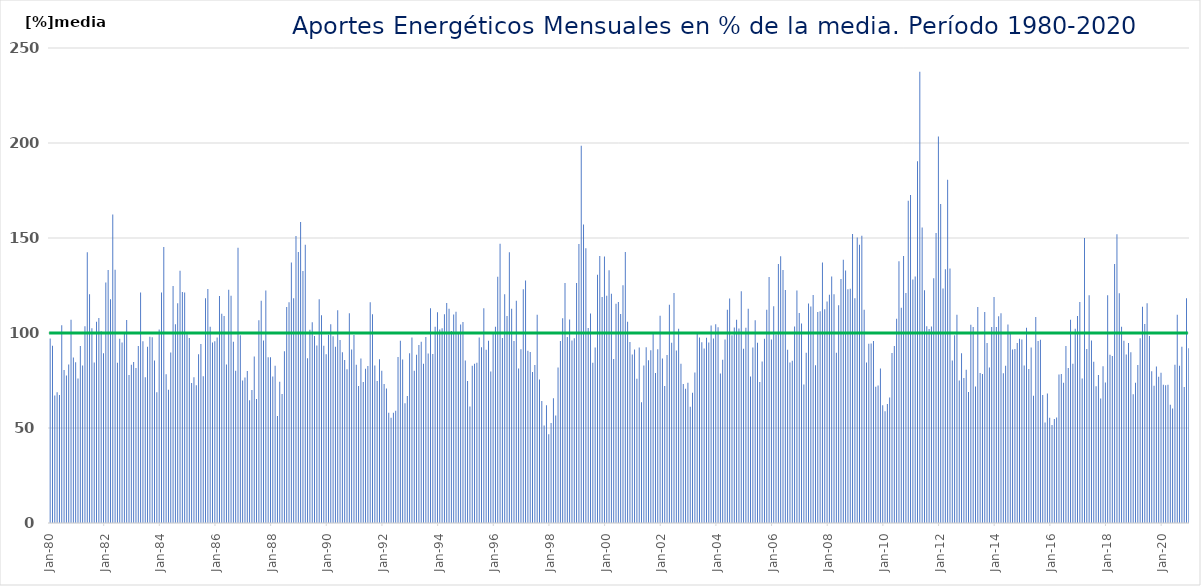
| Category | Series 0 |
|---|---|
| 1980-01-01 | 97.04 |
| 1980-02-01 | 93.35 |
| 1980-03-01 | 67.09 |
| 1980-04-01 | 68.78 |
| 1980-05-01 | 67.31 |
| 1980-06-01 | 104.04 |
| 1980-07-01 | 80.58 |
| 1980-08-01 | 77.65 |
| 1980-09-01 | 83.41 |
| 1980-10-01 | 107.02 |
| 1980-11-01 | 87.07 |
| 1980-12-01 | 84.62 |
| 1981-01-01 | 76.09 |
| 1981-02-01 | 93.13 |
| 1981-03-01 | 82.86 |
| 1981-04-01 | 103.58 |
| 1981-05-01 | 142.54 |
| 1981-06-01 | 120.41 |
| 1981-07-01 | 102.54 |
| 1981-08-01 | 84.46 |
| 1981-09-01 | 105.87 |
| 1981-10-01 | 107.93 |
| 1981-11-01 | 100.89 |
| 1981-12-01 | 89.32 |
| 1982-01-01 | 126.58 |
| 1982-02-01 | 133.17 |
| 1982-03-01 | 117.7 |
| 1982-04-01 | 162.43 |
| 1982-05-01 | 133.25 |
| 1982-06-01 | 84.28 |
| 1982-07-01 | 97.02 |
| 1982-08-01 | 94.94 |
| 1982-09-01 | 99.74 |
| 1982-10-01 | 106.89 |
| 1982-11-01 | 77.84 |
| 1982-12-01 | 83.27 |
| 1983-01-01 | 84.79 |
| 1983-02-01 | 81.56 |
| 1983-03-01 | 93.2 |
| 1983-04-01 | 121.37 |
| 1983-05-01 | 95.6 |
| 1983-06-01 | 76.69 |
| 1983-07-01 | 92.78 |
| 1983-08-01 | 97.99 |
| 1983-09-01 | 97.82 |
| 1983-10-01 | 85.51 |
| 1983-11-01 | 68.86 |
| 1983-12-01 | 101.85 |
| 1984-01-01 | 121.28 |
| 1984-02-01 | 145.3 |
| 1984-03-01 | 78.25 |
| 1984-04-01 | 70.14 |
| 1984-05-01 | 89.79 |
| 1984-06-01 | 124.8 |
| 1984-07-01 | 104.56 |
| 1984-08-01 | 115.72 |
| 1984-09-01 | 132.71 |
| 1984-10-01 | 121.58 |
| 1984-11-01 | 121.38 |
| 1984-12-01 | 99.3 |
| 1985-01-01 | 97.43 |
| 1985-02-01 | 73.7 |
| 1985-03-01 | 76.66 |
| 1985-04-01 | 72.49 |
| 1985-05-01 | 88.86 |
| 1985-06-01 | 94.27 |
| 1985-07-01 | 77.21 |
| 1985-08-01 | 118.3 |
| 1985-09-01 | 123.13 |
| 1985-10-01 | 103.23 |
| 1985-11-01 | 94.98 |
| 1985-12-01 | 95.66 |
| 1986-01-01 | 97.6 |
| 1986-02-01 | 119.45 |
| 1986-03-01 | 110.15 |
| 1986-04-01 | 108.98 |
| 1986-05-01 | 83.38 |
| 1986-06-01 | 122.73 |
| 1986-07-01 | 119.6 |
| 1986-08-01 | 95.37 |
| 1986-09-01 | 80.1 |
| 1986-10-01 | 144.84 |
| 1986-11-01 | 98.88 |
| 1986-12-01 | 74.94 |
| 1987-01-01 | 76.57 |
| 1987-02-01 | 80.06 |
| 1987-03-01 | 64.64 |
| 1987-04-01 | 70.06 |
| 1987-05-01 | 87.69 |
| 1987-06-01 | 65.27 |
| 1987-07-01 | 106.76 |
| 1987-08-01 | 116.97 |
| 1987-09-01 | 96.06 |
| 1987-10-01 | 122.32 |
| 1987-11-01 | 87.29 |
| 1987-12-01 | 87.24 |
| 1988-01-01 | 77.1 |
| 1988-02-01 | 82.79 |
| 1988-03-01 | 56.32 |
| 1988-04-01 | 74.33 |
| 1988-05-01 | 67.95 |
| 1988-06-01 | 90.45 |
| 1988-07-01 | 113.65 |
| 1988-08-01 | 116.23 |
| 1988-09-01 | 137.09 |
| 1988-10-01 | 118.27 |
| 1988-11-01 | 151.03 |
| 1988-12-01 | 142.66 |
| 1989-01-01 | 158.47 |
| 1989-02-01 | 132.61 |
| 1989-03-01 | 146.47 |
| 1989-04-01 | 86.71 |
| 1989-05-01 | 101.69 |
| 1989-06-01 | 105.63 |
| 1989-07-01 | 98.4 |
| 1989-08-01 | 93.48 |
| 1989-09-01 | 117.73 |
| 1989-10-01 | 109.33 |
| 1989-11-01 | 93.3 |
| 1989-12-01 | 88.76 |
| 1990-01-01 | 99.14 |
| 1990-02-01 | 104.59 |
| 1990-03-01 | 98.31 |
| 1990-04-01 | 92.75 |
| 1990-05-01 | 112.01 |
| 1990-06-01 | 96.3 |
| 1990-07-01 | 89.82 |
| 1990-08-01 | 85.79 |
| 1990-09-01 | 80.94 |
| 1990-10-01 | 110.4 |
| 1990-11-01 | 91.31 |
| 1990-12-01 | 98.96 |
| 1991-01-01 | 83.24 |
| 1991-02-01 | 72.17 |
| 1991-03-01 | 86.57 |
| 1991-04-01 | 74.15 |
| 1991-05-01 | 81.15 |
| 1991-06-01 | 82.64 |
| 1991-07-01 | 116.13 |
| 1991-08-01 | 109.88 |
| 1991-09-01 | 82.85 |
| 1991-10-01 | 74.69 |
| 1991-11-01 | 86.12 |
| 1991-12-01 | 80.16 |
| 1992-01-01 | 73.19 |
| 1992-02-01 | 70.83 |
| 1992-03-01 | 58.03 |
| 1992-04-01 | 55.34 |
| 1992-05-01 | 58.02 |
| 1992-06-01 | 59.04 |
| 1992-07-01 | 87.42 |
| 1992-08-01 | 95.98 |
| 1992-09-01 | 86.07 |
| 1992-10-01 | 63.03 |
| 1992-11-01 | 66.87 |
| 1992-12-01 | 89.37 |
| 1993-01-01 | 97.68 |
| 1993-02-01 | 80.17 |
| 1993-03-01 | 88.53 |
| 1993-04-01 | 93.73 |
| 1993-05-01 | 95.35 |
| 1993-06-01 | 83.84 |
| 1993-07-01 | 97.85 |
| 1993-08-01 | 89.16 |
| 1993-09-01 | 113.04 |
| 1993-10-01 | 88.94 |
| 1993-11-01 | 103.23 |
| 1993-12-01 | 110.94 |
| 1994-01-01 | 101.81 |
| 1994-02-01 | 102.5 |
| 1994-03-01 | 109.85 |
| 1994-04-01 | 115.8 |
| 1994-05-01 | 112.75 |
| 1994-06-01 | 101.09 |
| 1994-07-01 | 109.73 |
| 1994-08-01 | 111.21 |
| 1994-09-01 | 99.61 |
| 1994-10-01 | 104.49 |
| 1994-11-01 | 105.84 |
| 1994-12-01 | 85.47 |
| 1995-01-01 | 74.75 |
| 1995-02-01 | 61.31 |
| 1995-03-01 | 82.7 |
| 1995-04-01 | 83.83 |
| 1995-05-01 | 84.34 |
| 1995-06-01 | 97.64 |
| 1995-07-01 | 92.49 |
| 1995-08-01 | 112.97 |
| 1995-09-01 | 91.16 |
| 1995-10-01 | 95.92 |
| 1995-11-01 | 79.7 |
| 1995-12-01 | 100.26 |
| 1996-01-01 | 103.28 |
| 1996-02-01 | 129.59 |
| 1996-03-01 | 146.99 |
| 1996-04-01 | 97.32 |
| 1996-05-01 | 120.45 |
| 1996-06-01 | 108.96 |
| 1996-07-01 | 142.47 |
| 1996-08-01 | 112.78 |
| 1996-09-01 | 95.81 |
| 1996-10-01 | 117.02 |
| 1996-11-01 | 81.31 |
| 1996-12-01 | 91.44 |
| 1997-01-01 | 123 |
| 1997-02-01 | 127.69 |
| 1997-03-01 | 90.72 |
| 1997-04-01 | 89.95 |
| 1997-05-01 | 79.41 |
| 1997-06-01 | 83.19 |
| 1997-07-01 | 109.56 |
| 1997-08-01 | 75.53 |
| 1997-09-01 | 64.16 |
| 1997-10-01 | 51.33 |
| 1997-11-01 | 62.01 |
| 1997-12-01 | 46.72 |
| 1998-01-01 | 52.57 |
| 1998-02-01 | 65.64 |
| 1998-03-01 | 56.62 |
| 1998-04-01 | 81.8 |
| 1998-05-01 | 95.84 |
| 1998-06-01 | 107.71 |
| 1998-07-01 | 126.33 |
| 1998-08-01 | 97.93 |
| 1998-09-01 | 107.14 |
| 1998-10-01 | 96.11 |
| 1998-11-01 | 97.22 |
| 1998-12-01 | 126.31 |
| 1999-01-01 | 146.82 |
| 1999-02-01 | 198.57 |
| 1999-03-01 | 157.13 |
| 1999-04-01 | 144.61 |
| 1999-05-01 | 102.66 |
| 1999-06-01 | 110.26 |
| 1999-07-01 | 84.29 |
| 1999-08-01 | 92.38 |
| 1999-09-01 | 130.65 |
| 1999-10-01 | 140.53 |
| 1999-11-01 | 118.96 |
| 1999-12-01 | 140.29 |
| 2000-01-01 | 119.62 |
| 2000-02-01 | 133.06 |
| 2000-03-01 | 120.6 |
| 2000-04-01 | 86.35 |
| 2000-05-01 | 115.37 |
| 2000-06-01 | 116.35 |
| 2000-07-01 | 109.94 |
| 2000-08-01 | 125.19 |
| 2000-09-01 | 142.6 |
| 2000-10-01 | 105.91 |
| 2000-11-01 | 95.2 |
| 2000-12-01 | 88.69 |
| 2001-01-01 | 91.38 |
| 2001-02-01 | 75.89 |
| 2001-03-01 | 92.39 |
| 2001-04-01 | 63.58 |
| 2001-05-01 | 82.86 |
| 2001-06-01 | 92.49 |
| 2001-07-01 | 85.71 |
| 2001-08-01 | 90.87 |
| 2001-09-01 | 100.54 |
| 2001-10-01 | 78.96 |
| 2001-11-01 | 91.42 |
| 2001-12-01 | 109.04 |
| 2002-01-01 | 86.59 |
| 2002-02-01 | 72.11 |
| 2002-03-01 | 88.36 |
| 2002-04-01 | 114.88 |
| 2002-05-01 | 94.83 |
| 2002-06-01 | 121.11 |
| 2002-07-01 | 90.82 |
| 2002-08-01 | 102.25 |
| 2002-09-01 | 83.8 |
| 2002-10-01 | 73.11 |
| 2002-11-01 | 70.69 |
| 2002-12-01 | 73.83 |
| 2003-01-01 | 61.14 |
| 2003-02-01 | 68.6 |
| 2003-03-01 | 79.2 |
| 2003-04-01 | 99.86 |
| 2003-05-01 | 97.59 |
| 2003-06-01 | 95.08 |
| 2003-07-01 | 91.81 |
| 2003-08-01 | 97.51 |
| 2003-09-01 | 95.06 |
| 2003-10-01 | 103.92 |
| 2003-11-01 | 97.06 |
| 2003-12-01 | 104.64 |
| 2004-01-01 | 102.99 |
| 2004-02-01 | 78.65 |
| 2004-03-01 | 85.88 |
| 2004-04-01 | 96.6 |
| 2004-05-01 | 112.2 |
| 2004-06-01 | 118.21 |
| 2004-07-01 | 98.77 |
| 2004-08-01 | 102.94 |
| 2004-09-01 | 106.91 |
| 2004-10-01 | 102.36 |
| 2004-11-01 | 121.99 |
| 2004-12-01 | 91.76 |
| 2005-01-01 | 102.74 |
| 2005-02-01 | 112.7 |
| 2005-03-01 | 77.04 |
| 2005-04-01 | 92.41 |
| 2005-05-01 | 106.77 |
| 2005-06-01 | 94.89 |
| 2005-07-01 | 74.19 |
| 2005-08-01 | 85.05 |
| 2005-09-01 | 96.96 |
| 2005-10-01 | 112.18 |
| 2005-11-01 | 129.53 |
| 2005-12-01 | 96.56 |
| 2006-01-01 | 114.05 |
| 2006-02-01 | 99.18 |
| 2006-03-01 | 136.28 |
| 2006-04-01 | 140.4 |
| 2006-05-01 | 133.12 |
| 2006-06-01 | 122.69 |
| 2006-07-01 | 91.2 |
| 2006-08-01 | 84.48 |
| 2006-09-01 | 85.37 |
| 2006-10-01 | 103.39 |
| 2006-11-01 | 122.43 |
| 2006-12-01 | 110.55 |
| 2007-01-01 | 104.97 |
| 2007-02-01 | 72.88 |
| 2007-03-01 | 89.6 |
| 2007-04-01 | 115.48 |
| 2007-05-01 | 113.89 |
| 2007-06-01 | 119.95 |
| 2007-07-01 | 83.01 |
| 2007-08-01 | 111.02 |
| 2007-09-01 | 111.4 |
| 2007-10-01 | 137.13 |
| 2007-11-01 | 112.44 |
| 2007-12-01 | 116.53 |
| 2008-01-01 | 120.18 |
| 2008-02-01 | 129.79 |
| 2008-03-01 | 120.43 |
| 2008-04-01 | 89.6 |
| 2008-05-01 | 114.6 |
| 2008-06-01 | 128.42 |
| 2008-07-01 | 138.5 |
| 2008-08-01 | 132.84 |
| 2008-09-01 | 123.02 |
| 2008-10-01 | 123.34 |
| 2008-11-01 | 152.15 |
| 2008-12-01 | 118.29 |
| 2009-01-01 | 150.22 |
| 2009-02-01 | 146.39 |
| 2009-03-01 | 151.2 |
| 2009-04-01 | 112.28 |
| 2009-05-01 | 84.47 |
| 2009-06-01 | 94.28 |
| 2009-07-01 | 94.43 |
| 2009-08-01 | 95.85 |
| 2009-09-01 | 71.73 |
| 2009-10-01 | 72.35 |
| 2009-11-01 | 81.26 |
| 2009-12-01 | 62 |
| 2010-01-01 | 58.78 |
| 2010-02-01 | 62.6 |
| 2010-03-01 | 66.08 |
| 2010-04-01 | 89.48 |
| 2010-05-01 | 93.16 |
| 2010-06-01 | 107.49 |
| 2010-07-01 | 137.75 |
| 2010-08-01 | 113.23 |
| 2010-09-01 | 140.58 |
| 2010-10-01 | 121.11 |
| 2010-11-01 | 169.63 |
| 2010-12-01 | 172.58 |
| 2011-01-01 | 128.19 |
| 2011-02-01 | 129.79 |
| 2011-03-01 | 190.43 |
| 2011-04-01 | 237.47 |
| 2011-05-01 | 155.51 |
| 2011-06-01 | 122.56 |
| 2011-07-01 | 103.58 |
| 2011-08-01 | 102.13 |
| 2011-09-01 | 103.38 |
| 2011-10-01 | 128.77 |
| 2011-11-01 | 152.68 |
| 2011-12-01 | 203.47 |
| 2012-01-01 | 167.9 |
| 2012-02-01 | 123.42 |
| 2012-03-01 | 133.54 |
| 2012-04-01 | 180.7 |
| 2012-05-01 | 133.9 |
| 2012-06-01 | 85.59 |
| 2012-07-01 | 98.79 |
| 2012-08-01 | 109.6 |
| 2012-09-01 | 75.06 |
| 2012-10-01 | 89.35 |
| 2012-11-01 | 76.28 |
| 2012-12-01 | 80.61 |
| 2013-01-01 | 68.96 |
| 2013-02-01 | 104.34 |
| 2013-03-01 | 103.22 |
| 2013-04-01 | 71.78 |
| 2013-05-01 | 113.7 |
| 2013-06-01 | 78.97 |
| 2013-07-01 | 78.46 |
| 2013-08-01 | 111 |
| 2013-09-01 | 94.74 |
| 2013-10-01 | 81.81 |
| 2013-11-01 | 103.1 |
| 2013-12-01 | 119.01 |
| 2014-01-01 | 103.18 |
| 2014-02-01 | 108.85 |
| 2014-03-01 | 110.33 |
| 2014-04-01 | 78.86 |
| 2014-05-01 | 82.7 |
| 2014-06-01 | 104.42 |
| 2014-07-01 | 99.91 |
| 2014-08-01 | 91.31 |
| 2014-09-01 | 91.52 |
| 2014-10-01 | 94.71 |
| 2014-11-01 | 97.01 |
| 2014-12-01 | 96.63 |
| 2015-01-01 | 82.85 |
| 2015-02-01 | 102.74 |
| 2015-03-01 | 81.11 |
| 2015-04-01 | 92.4 |
| 2015-05-01 | 66.97 |
| 2015-06-01 | 108.42 |
| 2015-07-01 | 95.81 |
| 2015-08-01 | 96.47 |
| 2015-09-01 | 67.39 |
| 2015-10-01 | 52.84 |
| 2015-11-01 | 68.18 |
| 2015-12-01 | 55.35 |
| 2016-01-01 | 51.58 |
| 2016-02-01 | 54.78 |
| 2016-03-01 | 55.53 |
| 2016-04-01 | 78.15 |
| 2016-05-01 | 78.45 |
| 2016-06-01 | 73.77 |
| 2016-07-01 | 93.18 |
| 2016-08-01 | 81.53 |
| 2016-09-01 | 106.96 |
| 2016-10-01 | 83.85 |
| 2016-11-01 | 102.28 |
| 2016-12-01 | 108.92 |
| 2017-01-01 | 116.26 |
| 2017-02-01 | 76.05 |
| 2017-03-01 | 150.01 |
| 2017-04-01 | 91.55 |
| 2017-05-01 | 119.89 |
| 2017-06-01 | 96.04 |
| 2017-07-01 | 84.93 |
| 2017-08-01 | 72.01 |
| 2017-09-01 | 77.93 |
| 2017-10-01 | 65.53 |
| 2017-11-01 | 82.56 |
| 2017-12-01 | 74 |
| 2018-01-01 | 119.92 |
| 2018-02-01 | 88.51 |
| 2018-03-01 | 87.86 |
| 2018-04-01 | 136.3 |
| 2018-05-01 | 152 |
| 2018-06-01 | 120.88 |
| 2018-07-01 | 103.26 |
| 2018-08-01 | 95.892 |
| 2018-09-01 | 88.7 |
| 2018-10-01 | 94.79 |
| 2018-11-01 | 89.82 |
| 2018-12-01 | 67.8 |
| 2019-01-01 | 73.83 |
| 2019-02-01 | 83.14 |
| 2019-03-01 | 97.26 |
| 2019-04-01 | 113.8 |
| 2019-05-01 | 104.72 |
| 2019-06-01 | 115.6 |
| 2019-07-01 | 98.39 |
| 2019-08-01 | 79.87 |
| 2019-09-01 | 72.18 |
| 2019-10-01 | 82.33 |
| 2019-11-01 | 76.95 |
| 2019-12-01 | 79.13 |
| 2020-01-01 | 72.75 |
| 2020-02-01 | 72.51 |
| 2020-03-01 | 72.73 |
| 2020-04-01 | 62.18 |
| 2020-05-01 | 60.21 |
| 2020-06-01 | 83.29 |
| 2020-07-01 | 109.54 |
| 2020-08-01 | 82.77 |
| 2020-09-01 | 92.81 |
| 2020-10-01 | 71.52 |
| 2020-11-01 | 118.33 |
| 2020-12-01 | 92.03 |